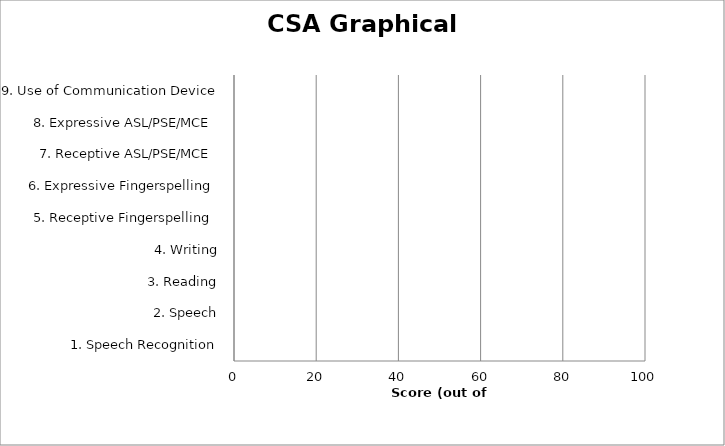
| Category | Series 0 | Series 1 | Series 2 |
|---|---|---|---|
| 1. Speech Recognition |  |  | 0 |
| 2. Speech |  |  | 0 |
| 3. Reading |  |  | 0 |
| 4. Writing |  |  | 0 |
| 5. Receptive Fingerspelling  |  |  | 0 |
| 6. Expressive Fingerspelling  |  |  | 0 |
| 7. Receptive ASL/PSE/MCE  |  |  | 0 |
| 8. Expressive ASL/PSE/MCE  |  |  | 0 |
| 9. Use of Communication Device |  |  | 0 |